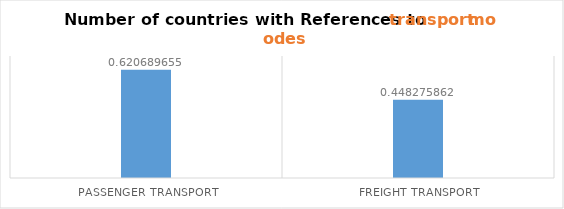
| Category | Series 0 |
|---|---|
| Passenger Transport | 0.621 |
| Freight Transport | 0.448 |